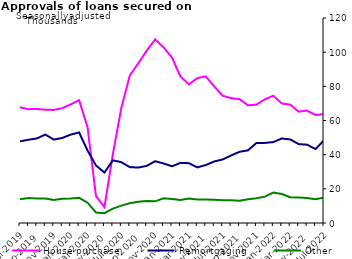
| Category | House purchase | Remortgaging | Other |
|---|---|---|---|
| Jul-2019 | 67726 | 47757 | 13951 |
| Aug-2019 | 66631 | 48740 | 14598 |
| Sep-2019 | 66760 | 49498 | 14346 |
| Oct-2019 | 66308 | 51784 | 14397 |
| Nov-2019 | 66181 | 48829 | 13506 |
| Dec-2019 | 67209 | 49757 | 14237 |
| Jan-2020 | 69435 | 51728 | 14389 |
| Feb-2020 | 71864 | 53014 | 14721 |
| Mar-2020 | 56042 | 42414 | 11885 |
| Apr-2020 | 15759 | 33664 | 6167 |
| May-2020 | 9283 | 29543 | 5772 |
| Jun-2020 | 40418 | 36698 | 8454 |
| Jul-2020 | 67399 | 35591 | 10157 |
| Aug-2020 | 86293 | 32727 | 11529 |
| Sep-2020 | 93409 | 32448 | 12388 |
| Oct-2020 | 100896 | 33422 | 12867 |
| Nov-2020 | 107458 | 36149 | 12692 |
| Dec-2020 | 102870 | 34849 | 14489 |
| Jan-2021 | 96815 | 33194 | 14013 |
| Feb-2021 | 85723 | 35206 | 13494 |
| Mar-2021 | 81139 | 35015 | 14330 |
| Apr-2021 | 84807 | 32544 | 13820 |
| May-2021 | 85856 | 33935 | 13799 |
| Jun-2021 | 79916 | 36005 | 13672 |
| Jul-2021 | 74494 | 37195 | 13361 |
| Aug-2021 | 73075 | 39523 | 13255 |
| Sep-2021 | 72490 | 41684 | 13033 |
| Oct-2021 | 68878 | 42526 | 13908 |
| Nov-2021 | 69302 | 46873 | 14550 |
| Dec-2021 | 72413 | 46878 | 15436 |
| Jan-2022 | 74478 | 47371 | 17814 |
| Feb-2022 | 69971 | 49484 | 16941 |
| Mar-2022 | 69272 | 48924 | 15097 |
| Apr-2022 | 65190 | 46181 | 14989 |
| May-2022 | 65800 | 45836 | 14613 |
| Jun-2022 | 63184 | 43267 | 13938 |
| Jul-2022 | 63770 | 48447 | 14942 |